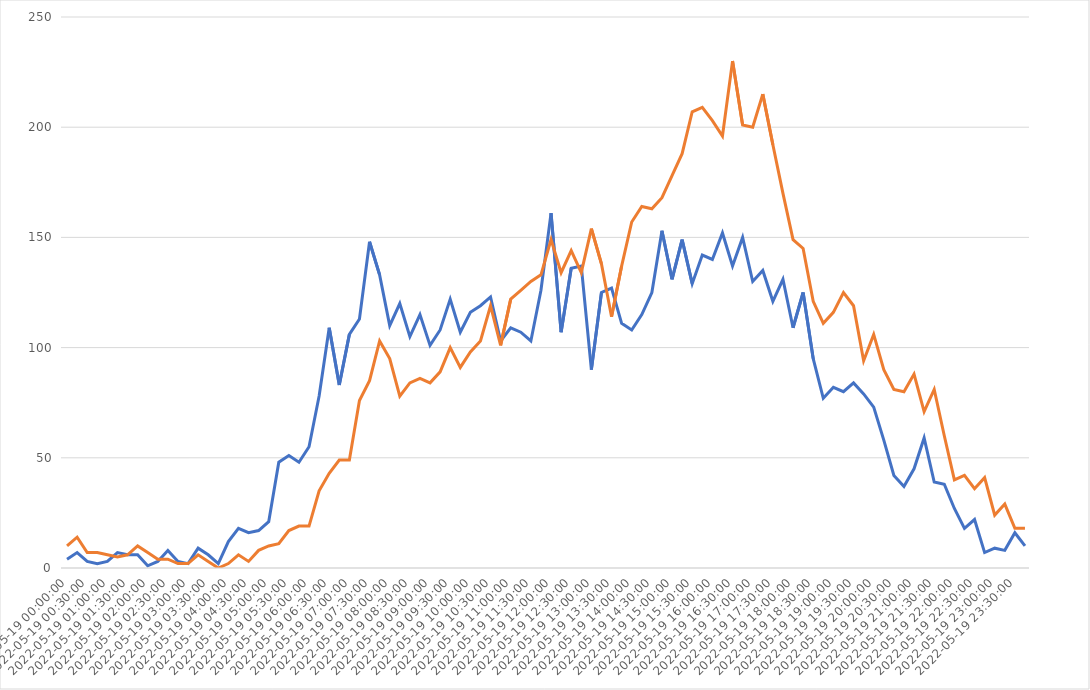
| Category | Eastbound | Westbound |
|---|---|---|
| 2022-05-19 | 4 | 10 |
| 2022-05-19 00:15:00 | 7 | 14 |
| 2022-05-19 00:30:00 | 3 | 7 |
| 2022-05-19 00:45:00 | 2 | 7 |
| 2022-05-19 01:00:00 | 3 | 6 |
| 2022-05-19 01:15:00 | 7 | 5 |
| 2022-05-19 01:30:00 | 6 | 6 |
| 2022-05-19 01:45:00 | 6 | 10 |
| 2022-05-19 02:00:00 | 1 | 7 |
| 2022-05-19 02:15:00 | 3 | 4 |
| 2022-05-19 02:30:00 | 8 | 4 |
| 2022-05-19 02:45:00 | 3 | 2 |
| 2022-05-19 03:00:00 | 2 | 2 |
| 2022-05-19 03:15:00 | 9 | 6 |
| 2022-05-19 03:30:00 | 6 | 3 |
| 2022-05-19 03:45:00 | 2 | 0 |
| 2022-05-19 04:00:00 | 12 | 2 |
| 2022-05-19 04:15:00 | 18 | 6 |
| 2022-05-19 04:30:00 | 16 | 3 |
| 2022-05-19 04:45:00 | 17 | 8 |
| 2022-05-19 05:00:00 | 21 | 10 |
| 2022-05-19 05:15:00 | 48 | 11 |
| 2022-05-19 05:30:00 | 51 | 17 |
| 2022-05-19 05:45:00 | 48 | 19 |
| 2022-05-19 06:00:00 | 55 | 19 |
| 2022-05-19 06:15:00 | 78 | 35 |
| 2022-05-19 06:30:00 | 109 | 43 |
| 2022-05-19 06:45:00 | 83 | 49 |
| 2022-05-19 07:00:00 | 106 | 49 |
| 2022-05-19 07:15:00 | 113 | 76 |
| 2022-05-19 07:30:00 | 148 | 85 |
| 2022-05-19 07:45:00 | 133 | 103 |
| 2022-05-19 08:00:00 | 110 | 95 |
| 2022-05-19 08:15:00 | 120 | 78 |
| 2022-05-19 08:30:00 | 105 | 84 |
| 2022-05-19 08:45:00 | 115 | 86 |
| 2022-05-19 09:00:00 | 101 | 84 |
| 2022-05-19 09:15:00 | 108 | 89 |
| 2022-05-19 09:30:00 | 122 | 100 |
| 2022-05-19 09:45:00 | 107 | 91 |
| 2022-05-19 10:00:00 | 116 | 98 |
| 2022-05-19 10:15:00 | 119 | 103 |
| 2022-05-19 10:30:00 | 123 | 119 |
| 2022-05-19 10:45:00 | 103 | 101 |
| 2022-05-19 11:00:00 | 109 | 122 |
| 2022-05-19 11:15:00 | 107 | 126 |
| 2022-05-19 11:30:00 | 103 | 130 |
| 2022-05-19 11:45:00 | 126 | 133 |
| 2022-05-19 12:00:00 | 161 | 149 |
| 2022-05-19 12:15:00 | 107 | 134 |
| 2022-05-19 12:30:00 | 136 | 144 |
| 2022-05-19 12:45:00 | 137 | 134 |
| 2022-05-19 13:00:00 | 90 | 154 |
| 2022-05-19 13:15:00 | 125 | 138 |
| 2022-05-19 13:30:00 | 127 | 114 |
| 2022-05-19 13:45:00 | 111 | 137 |
| 2022-05-19 14:00:00 | 108 | 157 |
| 2022-05-19 14:15:00 | 115 | 164 |
| 2022-05-19 14:30:00 | 125 | 163 |
| 2022-05-19 14:45:00 | 153 | 168 |
| 2022-05-19 15:00:00 | 131 | 178 |
| 2022-05-19 15:15:00 | 149 | 188 |
| 2022-05-19 15:30:00 | 129 | 207 |
| 2022-05-19 15:45:00 | 142 | 209 |
| 2022-05-19 16:00:00 | 140 | 203 |
| 2022-05-19 16:15:00 | 152 | 196 |
| 2022-05-19 16:30:00 | 137 | 230 |
| 2022-05-19 16:45:00 | 150 | 201 |
| 2022-05-19 17:00:00 | 130 | 200 |
| 2022-05-19 17:15:00 | 135 | 215 |
| 2022-05-19 17:30:00 | 121 | 192 |
| 2022-05-19 17:45:00 | 131 | 170 |
| 2022-05-19 18:00:00 | 109 | 149 |
| 2022-05-19 18:15:00 | 125 | 145 |
| 2022-05-19 18:30:00 | 95 | 121 |
| 2022-05-19 18:45:00 | 77 | 111 |
| 2022-05-19 19:00:00 | 82 | 116 |
| 2022-05-19 19:15:00 | 80 | 125 |
| 2022-05-19 19:30:00 | 84 | 119 |
| 2022-05-19 19:45:00 | 79 | 94 |
| 2022-05-19 20:00:00 | 73 | 106 |
| 2022-05-19 20:15:00 | 58 | 90 |
| 2022-05-19 20:30:00 | 42 | 81 |
| 2022-05-19 20:45:00 | 37 | 80 |
| 2022-05-19 21:00:00 | 45 | 88 |
| 2022-05-19 21:15:00 | 59 | 71 |
| 2022-05-19 21:30:00 | 39 | 81 |
| 2022-05-19 21:45:00 | 38 | 60 |
| 2022-05-19 22:00:00 | 27 | 40 |
| 2022-05-19 22:15:00 | 18 | 42 |
| 2022-05-19 22:30:00 | 22 | 36 |
| 2022-05-19 22:45:00 | 7 | 41 |
| 2022-05-19 23:00:00 | 9 | 24 |
| 2022-05-19 23:15:00 | 8 | 29 |
| 2022-05-19 23:30:00 | 16 | 18 |
| 2022-05-19 23:45:00 | 10 | 18 |